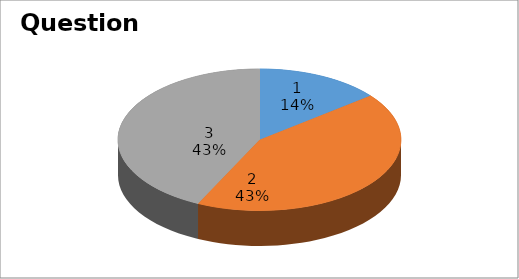
| Category | Series 0 |
|---|---|
| 0 | 2 |
| 1 | 6 |
| 2 | 6 |